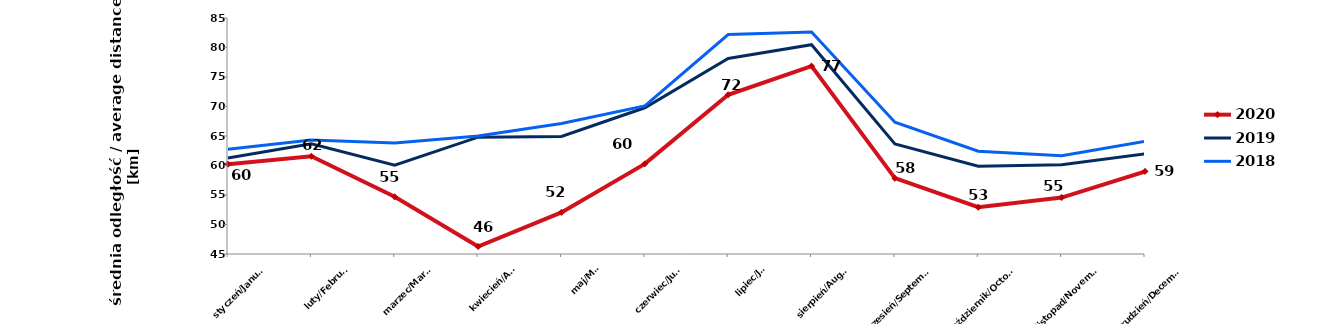
| Category | 2020 | 2019 | 2018 |
|---|---|---|---|
| styczeń/January | 60.221 | 61.272 | 62.75 |
| luty/February | 61.574 | 63.669 | 64.318 |
| marzec/March | 54.697 | 60.052 | 63.824 |
| kwiecień/April | 46.272 | 64.799 | 64.991 |
| maj/May | 52.053 | 64.925 | 67.112 |
| czerwiec/June | 60.27 | 69.783 | 70.109 |
| lipiec/July | 71.991 | 78.134 | 82.19 |
| sierpień/August | 76.853 | 80.473 | 82.613 |
| wrzesień/September | 57.849 | 63.66 | 67.347 |
| październik/October | 52.923 | 59.871 | 62.419 |
| listopad/November | 54.565 | 60.119 | 61.658 |
| grudzień/December | 58.986 | 61.956 | 64.113 |